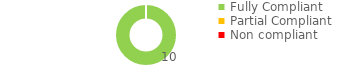
| Category | Series 0 |
|---|---|
| Fully Compliant | 10 |
| Partial Compliant | 0 |
| Non compliant | 0 |